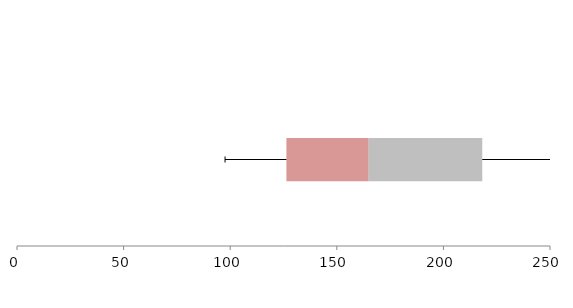
| Category | Series 1 | Series 2 | Series 3 |
|---|---|---|---|
| 0 | 126.367 | 38.593 | 53.267 |